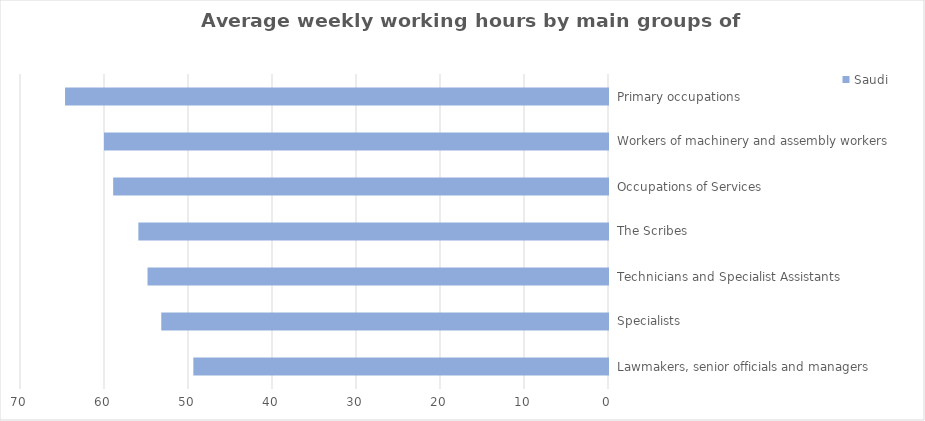
| Category | Saudi    | Non-Saudi   |
|---|---|---|
| Lawmakers, senior officials and managers | 49.364 |  |
| Specialists | 53.182 |  |
| Technicians and Specialist Assistants | 54.818 |  |
| The Scribes | 55.909 |  |
| Occupations of Services | 58.909 |  |
| Workers of machinery and assembly workers | 60 |  |
| Primary occupations | 64.636 |  |